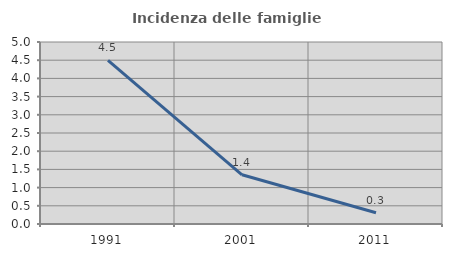
| Category | Incidenza delle famiglie numerose |
|---|---|
| 1991.0 | 4.494 |
| 2001.0 | 1.351 |
| 2011.0 | 0.308 |